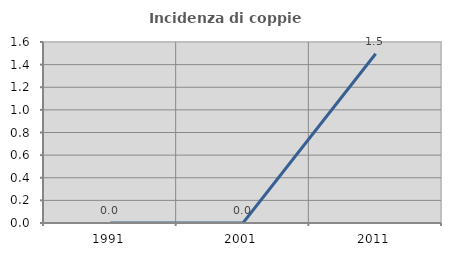
| Category | Incidenza di coppie miste |
|---|---|
| 1991.0 | 0 |
| 2001.0 | 0 |
| 2011.0 | 1.496 |